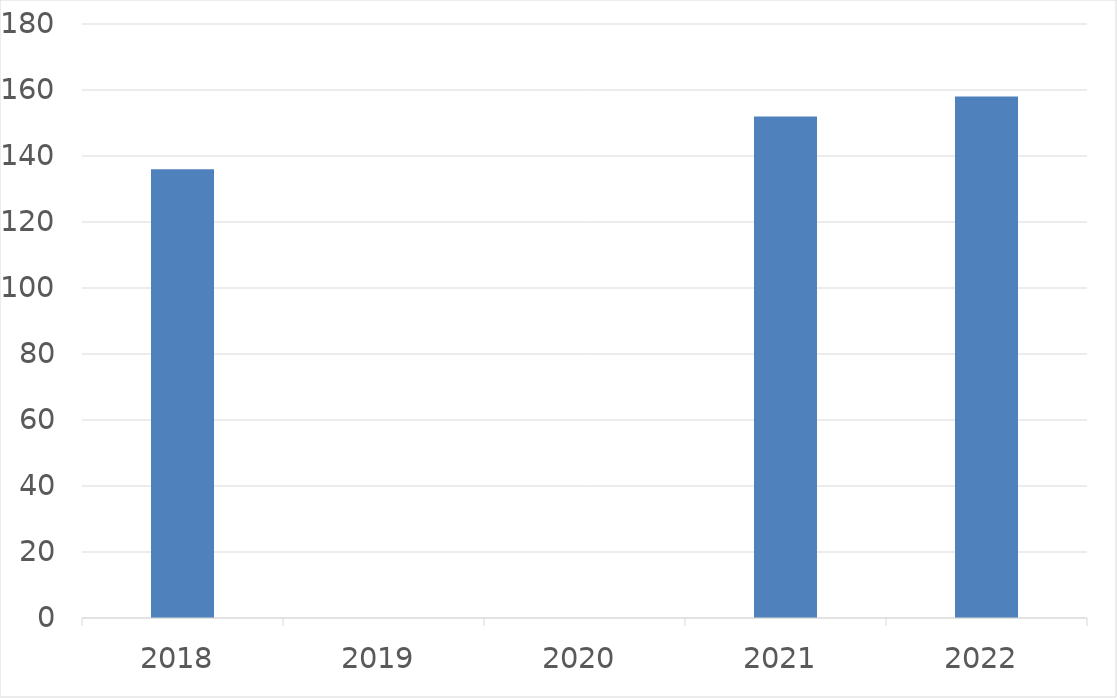
| Category | Series 0 |
|---|---|
| 2018 | 136 |
| 2019 | 0 |
| 2020 | 0 |
| 2021 | 152 |
| 2022 | 158 |